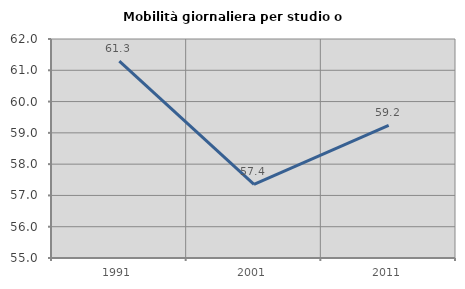
| Category | Mobilità giornaliera per studio o lavoro |
|---|---|
| 1991.0 | 61.295 |
| 2001.0 | 57.356 |
| 2011.0 | 59.238 |